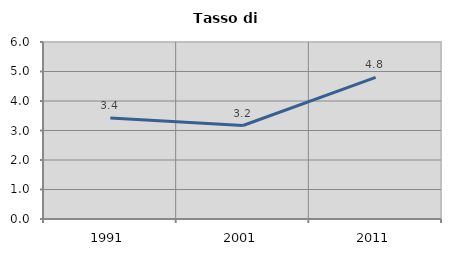
| Category | Tasso di disoccupazione   |
|---|---|
| 1991.0 | 3.428 |
| 2001.0 | 3.169 |
| 2011.0 | 4.798 |